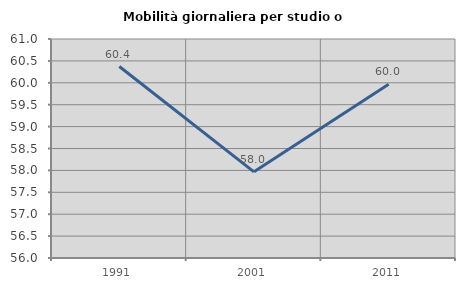
| Category | Mobilità giornaliera per studio o lavoro |
|---|---|
| 1991.0 | 60.371 |
| 2001.0 | 57.967 |
| 2011.0 | 59.967 |